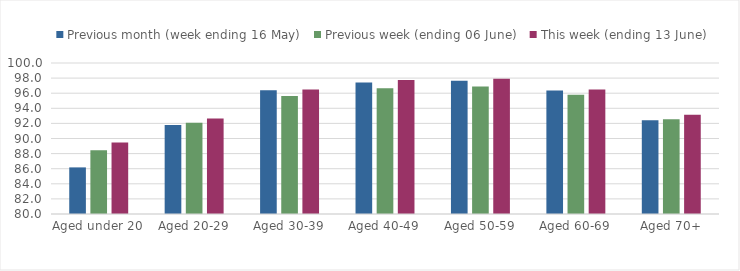
| Category | Previous month (week ending 16 May) | Previous week (ending 06 June) | This week (ending 13 June) |
|---|---|---|---|
| Aged under 20 | 86.173 | 88.429 | 89.455 |
| Aged 20-29 | 91.804 | 92.097 | 92.634 |
| Aged 30-39 | 96.384 | 95.618 | 96.506 |
| Aged 40-49 | 97.416 | 96.66 | 97.757 |
| Aged 50-59 | 97.644 | 96.888 | 97.917 |
| Aged 60-69 | 96.373 | 95.803 | 96.477 |
| Aged 70+ | 92.424 | 92.542 | 93.151 |